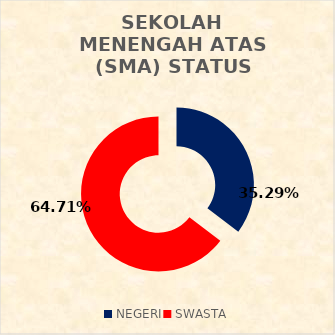
| Category | SEKOLAH MENENGAH ATAS (SMA) STATUS SEKOLAH |
|---|---|
| NEGERI | 12 |
| SWASTA | 22 |